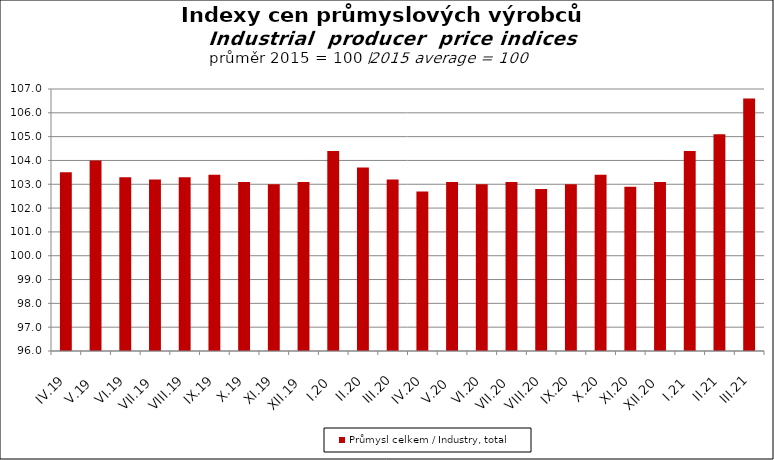
| Category | Průmysl celkem / Industry, total |
|---|---|
| IV.19 | 103.5 |
| V.19 | 104 |
| VI.19 | 103.3 |
| VII.19 | 103.2 |
| VIII.19 | 103.3 |
| IX.19 | 103.4 |
| X.19 | 103.1 |
| XI.19 | 103 |
| XII.19 | 103.1 |
| I.20 | 104.4 |
| II.20 | 103.7 |
| III.20 | 103.2 |
| IV.20 | 102.7 |
| V.20 | 103.1 |
| VI.20 | 103 |
| VII.20 | 103.1 |
| VIII.20 | 102.8 |
| IX.20 | 103 |
| X.20 | 103.4 |
| XI.20 | 102.9 |
| XII.20 | 103.1 |
| I.21 | 104.4 |
| II.21 | 105.1 |
| III.21 | 106.6 |